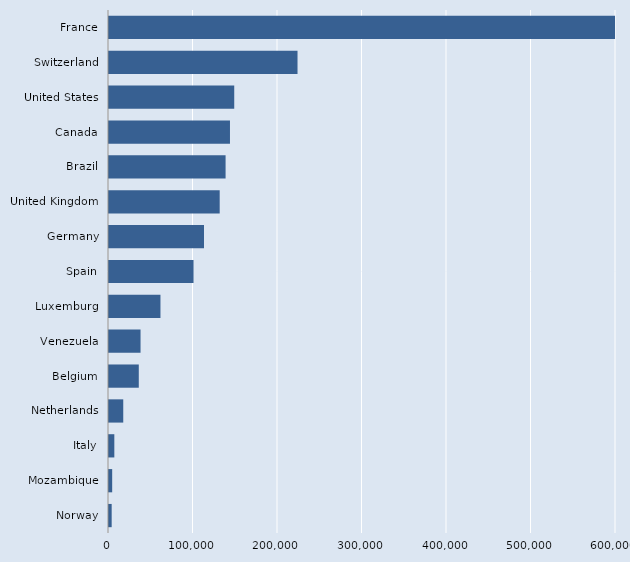
| Category | Series 0 |
|---|---|
| Norway | 3166 |
| Mozambique | 3767 |
| Italy | 6305 |
| Netherlands | 16868 |
| Belgium | 35249 |
| Venezuela | 37326 |
| Luxemburg | 60897 |
| Spain | 100027 |
| Germany | 112430 |
| United Kingdom | 131000 |
| Brazil | 137973 |
| Canada | 143160 |
| United States | 148208 |
| Switzerland | 223099 |
| France | 615573 |